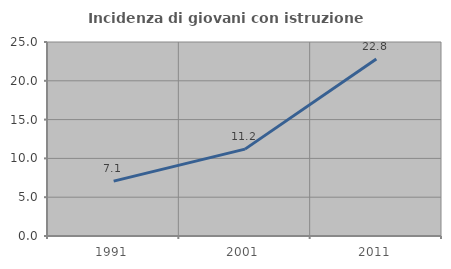
| Category | Incidenza di giovani con istruzione universitaria |
|---|---|
| 1991.0 | 7.071 |
| 2001.0 | 11.194 |
| 2011.0 | 22.812 |